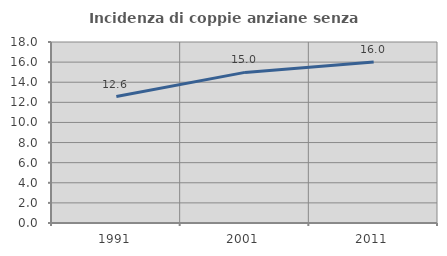
| Category | Incidenza di coppie anziane senza figli  |
|---|---|
| 1991.0 | 12.58 |
| 2001.0 | 14.978 |
| 2011.0 | 16.012 |